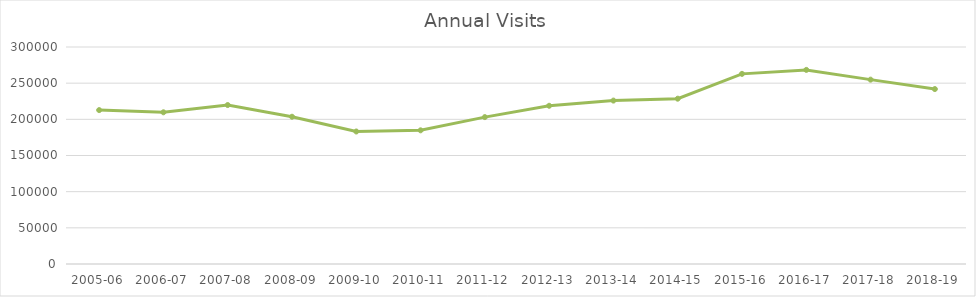
| Category | Series 0 |
|---|---|
| 2005-06 | 212770 |
| 2006-07 | 209725 |
| 2007-08 | 219750 |
| 2008-09 | 203589 |
| 2009-10 | 183186 |
| 2010-11 | 184812 |
| 2011-12 | 203074 |
| 2012-13 | 218745 |
| 2013-14 | 225912 |
| 2014-15 | 228538 |
| 2015-16 | 262865 |
| 2016-17 | 268347 |
| 2017-18 | 254873 |
| 2018-19 | 241853 |